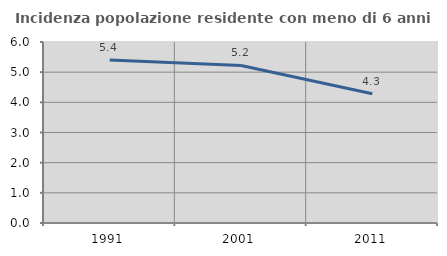
| Category | Incidenza popolazione residente con meno di 6 anni |
|---|---|
| 1991.0 | 5.403 |
| 2001.0 | 5.222 |
| 2011.0 | 4.283 |